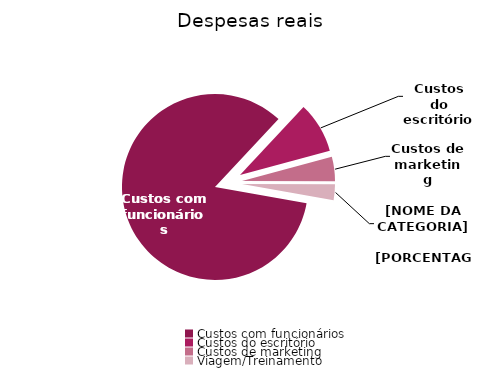
| Category | Series 0 |
|---|---|
| Custos com funcionários | 659130 |
| Custos do escritório | 69350 |
| Custos de marketing | 33159 |
| Viagem/Treinamento | 21300 |